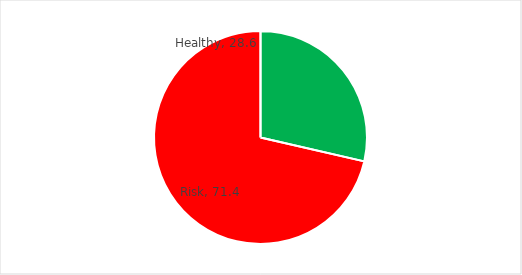
| Category | Women |
|---|---|
| Healthy | 28.6 |
| Risk | 71.4 |